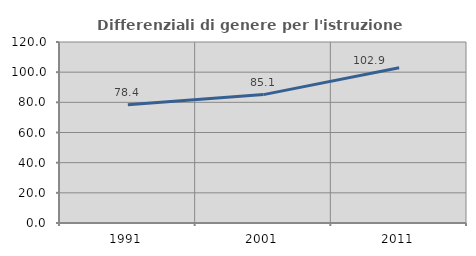
| Category | Differenziali di genere per l'istruzione superiore |
|---|---|
| 1991.0 | 78.35 |
| 2001.0 | 85.117 |
| 2011.0 | 102.882 |